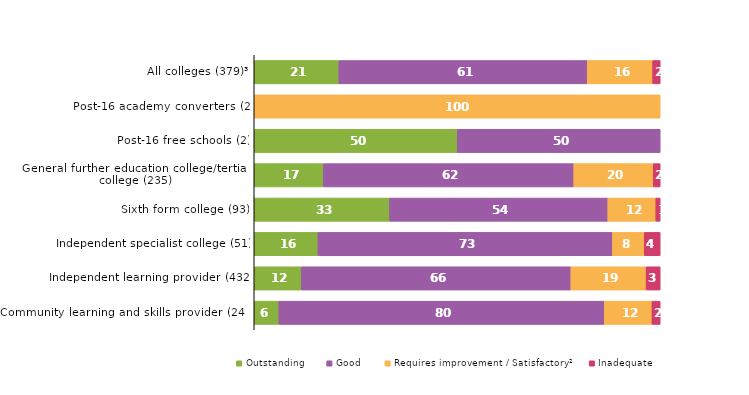
| Category | Outstanding | Good | Requires improvement / Satisfactory² | Inadequate |
|---|---|---|---|---|
| All colleges (379)³ | 20.844 | 61.214 | 16.095 | 1.847 |
| Post-16 academy converters (2) | 0 | 0 | 100 | 0 |
| Post-16 free schools (2) | 50 | 50 | 0 | 0 |
| General further education college/tertiary college (235) | 17.021 | 61.702 | 19.574 | 1.702 |
| Sixth form college (93) | 33.333 | 53.763 | 11.828 | 1.075 |
| Independent specialist college (51) | 15.686 | 72.549 | 7.843 | 3.922 |
| Independent learning provider (432) | 11.574 | 66.435 | 18.519 | 3.472 |
| Community learning and skills provider (247) | 6.073 | 80.162 | 11.741 | 2.024 |